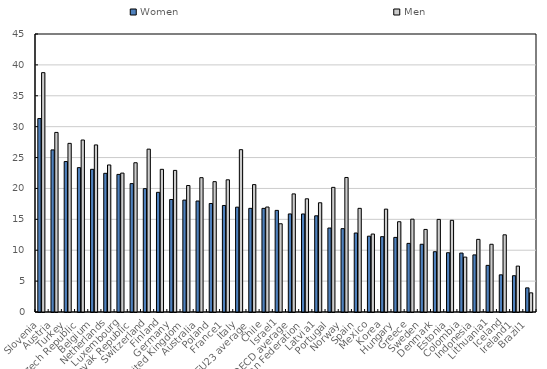
| Category | Women | Men |
|---|---|---|
| Slovenia | 31.313 | 38.744 |
| Austria | 26.237 | 29.07 |
| Turkey | 24.352 | 27.296 |
| Czech Republic | 23.369 | 27.842 |
| Belgium | 23.096 | 27.044 |
| Netherlands | 22.449 | 23.801 |
| Luxembourg | 22.27 | 22.483 |
| Slovak Republic | 20.784 | 24.16 |
| Switzerland | 19.967 | 26.362 |
| Finland | 19.37 | 23.096 |
| Germany | 18.211 | 22.921 |
| United Kingdom | 18.114 | 20.472 |
| Australia | 17.966 | 21.746 |
| Poland | 17.563 | 21.1 |
| France1 | 17.244 | 21.398 |
| Italy | 16.97 | 26.275 |
| EU23 average | 16.777 | 20.62 |
| Chile | 16.775 | 16.991 |
| Israel1 | 16.449 | 14.284 |
| OECD average | 15.872 | 19.116 |
| Russian Federation | 15.866 | 18.323 |
| Latvia1 | 15.571 | 17.68 |
| Portugal | 13.595 | 20.174 |
| Norway | 13.49 | 21.775 |
| Spain | 12.786 | 16.777 |
| Mexico | 12.272 | 12.62 |
| Korea | 12.193 | 16.65 |
| Hungary | 12.075 | 14.612 |
| Greece | 11.108 | 15.027 |
| Sweden | 10.966 | 13.367 |
| Denmark | 9.759 | 14.99 |
| Estonia | 9.595 | 14.841 |
| Colombia | 9.539 | 8.887 |
| Indonesia | 9.244 | 11.757 |
| Lithuania1 | 7.548 | 10.963 |
| Iceland | 6.015 | 12.494 |
| Ireland1 | 5.875 | 7.43 |
| Brazil1 | 3.907 | 3.1 |